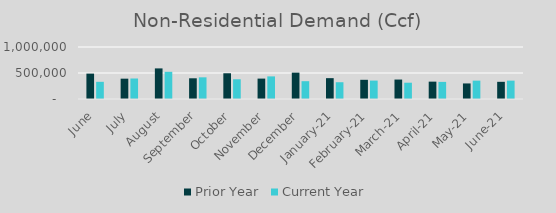
| Category | Prior Year | Current Year |
|---|---|---|
| June | 488107.52 | 330441.187 |
| July | 390975.65 | 394304.316 |
| August | 588468.22 | 522963.473 |
| September | 398263 | 416886.629 |
| October | 494775 | 379515 |
| November | 392357 | 434815 |
| December | 507022 | 342584.594 |
| January-21 | 400923.849 | 322657.16 |
| February-21 | 369131.684 | 354041 |
| March-21 | 374117 | 313343 |
| April-21 | 333800.488 | 329084.722 |
| May-21 | 299245.56 | 353085 |
| June-21 | 330441.187 | 353141.442 |